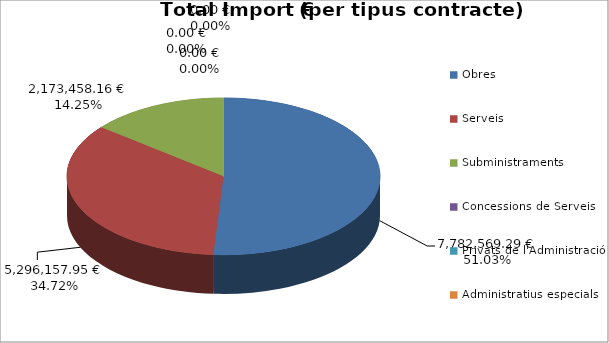
| Category | Total preu              (amb iva) |
|---|---|
| Obres | 7782569.294 |
| Serveis | 5296157.947 |
| Subministraments | 2173458.162 |
| Concessions de Serveis | 0 |
| Privats de l'Administració | 0 |
| Administratius especials | 0 |